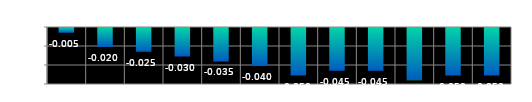
| Category | Series 0 |
|---|---|
| 0 | -0.005 |
| 1 | -0.02 |
| 2 | -0.025 |
| 3 | -0.03 |
| 4 | -0.035 |
| 5 | -0.04 |
| 6 | -0.05 |
| 7 | -0.045 |
| 8 | -0.045 |
| 9 | -0.055 |
| 10 | -0.05 |
| 11 | -0.05 |